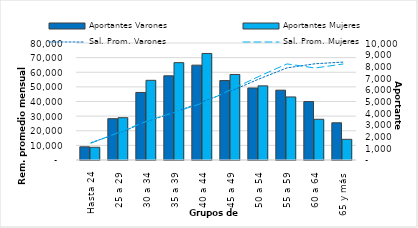
| Category | Aportantes Varones | Aportantes Mujeres |
|---|---|---|
| Hasta 24 | 1128 | 1087 |
| 25 a 29 | 3531 | 3616 |
| 30 a 34 | 5774 | 6810 |
| 35 a 39 | 7195 | 8322 |
| 40 a 44 | 8107 | 9106 |
| 45 a 49 | 6791 | 7310 |
| 50 a 54 | 6155 | 6337 |
| 55 a 59 | 5968 | 5389 |
| 60 a 64 | 4993 | 3481 |
| 65 y más | 3180 | 1769 |